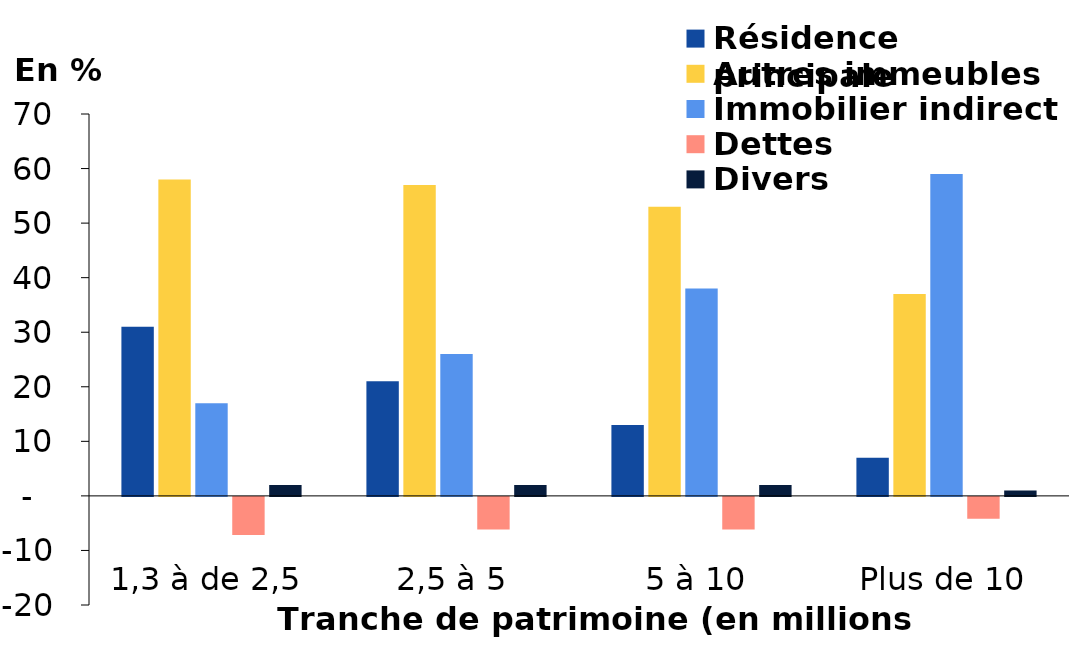
| Category | Résidence principale | Autres immeubles | Immobilier indirect | Dettes | Divers |
|---|---|---|---|---|---|
| 1,3 à de 2,5 | 31 | 58 | 17 | -7 | 2 |
| 2,5 à 5 | 21 | 57 | 26 | -6 | 2 |
| 5 à 10 | 13 | 53 | 38 | -6 | 2 |
| Plus de 10 | 7 | 37 | 59 | -4 | 1 |